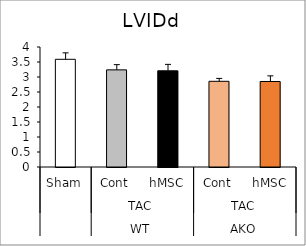
| Category | Series 0 |
|---|---|
| 0 | 3.59 |
| 1 | 3.238 |
| 2 | 3.207 |
| 3 | 2.857 |
| 4 | 2.85 |